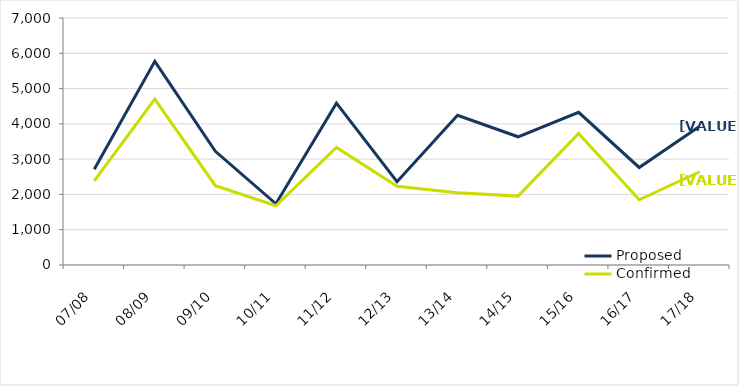
| Category | Proposed | Confirmed |
|---|---|---|
| 07/08 | 2712 | 2383 |
| 08/09 | 5771 | 4703 |
| 09/10 | 3223 | 2247 |
| 10/11 | 1734 | 1680 |
| 11/12 | 4586 | 3330 |
| 12/13 | 2360 | 2233 |
| 13/14 | 4242 | 2048 |
| 14/15 | 3634 | 1952 |
| 15/16 | 4326 | 3730 |
| 16/17 | 2764 | 1848 |
| 17/18 | 3934 | 2643 |